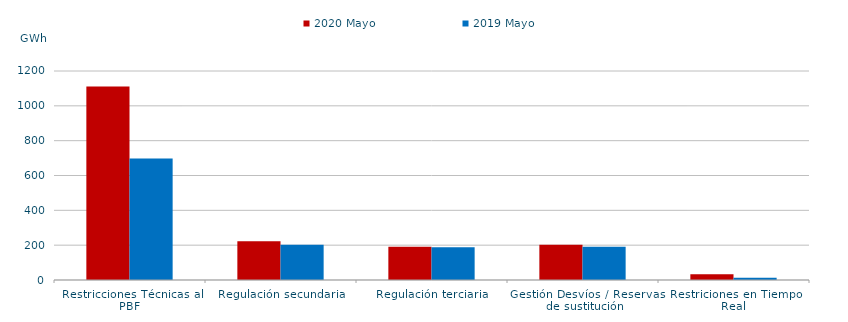
| Category | 2020 Mayo | 2019 Mayo |
|---|---|---|
| Restricciones Técnicas al PBF | 1110.496 | 697.014 |
| Regulación secundaria | 222.817 | 202.65 |
| Regulación terciaria | 190.211 | 187.521 |
| Gestión Desvíos / Reservas de sustitución | 203.1 | 191.511 |
| Restriciones en Tiempo Real | 32.944 | 12.343 |